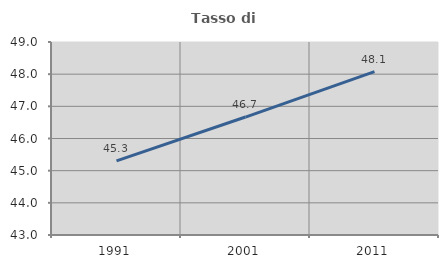
| Category | Tasso di occupazione   |
|---|---|
| 1991.0 | 45.302 |
| 2001.0 | 46.667 |
| 2011.0 | 48.079 |